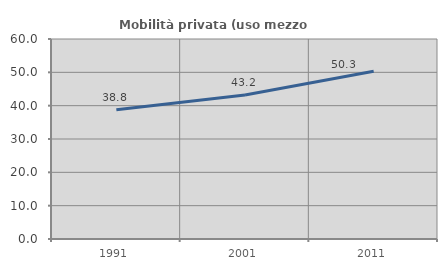
| Category | Mobilità privata (uso mezzo privato) |
|---|---|
| 1991.0 | 38.788 |
| 2001.0 | 43.223 |
| 2011.0 | 50.321 |